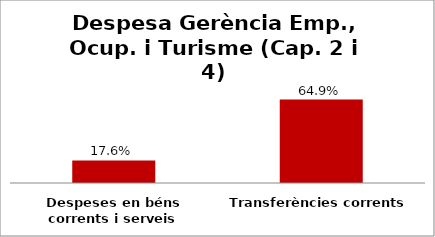
| Category | Series 0 |
|---|---|
| Despeses en béns corrents i serveis | 0.176 |
| Transferències corrents | 0.649 |